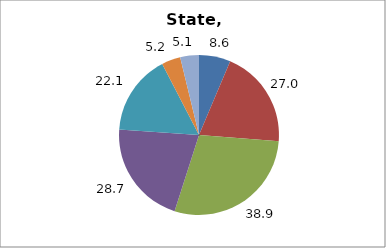
| Category | Series 0 |
|---|---|
| Higher Education | 8.645 |
| Elementary and Secondary Education | 26.956 |
| Total Education1 | 38.901 |
| Social Welfare2 | 28.674 |
| Transportation, Public Safety, Environment and Housing3 | 22.121 |
| Administration | 5.172 |
| Other4 | 5.132 |